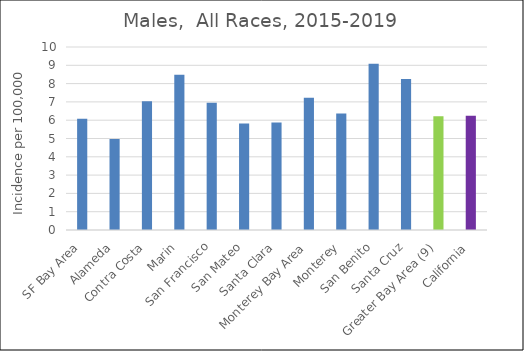
| Category | Male |
|---|---|
| SF Bay Area | 6.08 |
|   Alameda | 4.97 |
|   Contra Costa | 7.04 |
|   Marin | 8.48 |
|   San Francisco | 6.95 |
|   San Mateo | 5.82 |
|   Santa Clara | 5.87 |
| Monterey Bay Area | 7.22 |
|   Monterey | 6.37 |
|   San Benito | 9.09 |
|   Santa Cruz | 8.25 |
| Greater Bay Area (9) | 6.21 |
| California | 6.24 |